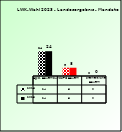
| Category | 2018 | 2023 |
|---|---|---|
| Bgld. Bauernbund | 24 | 24 |
| SPÖ Bauern | 8 | 8 |
| Freiheitliche Bauern | 0 | 0 |